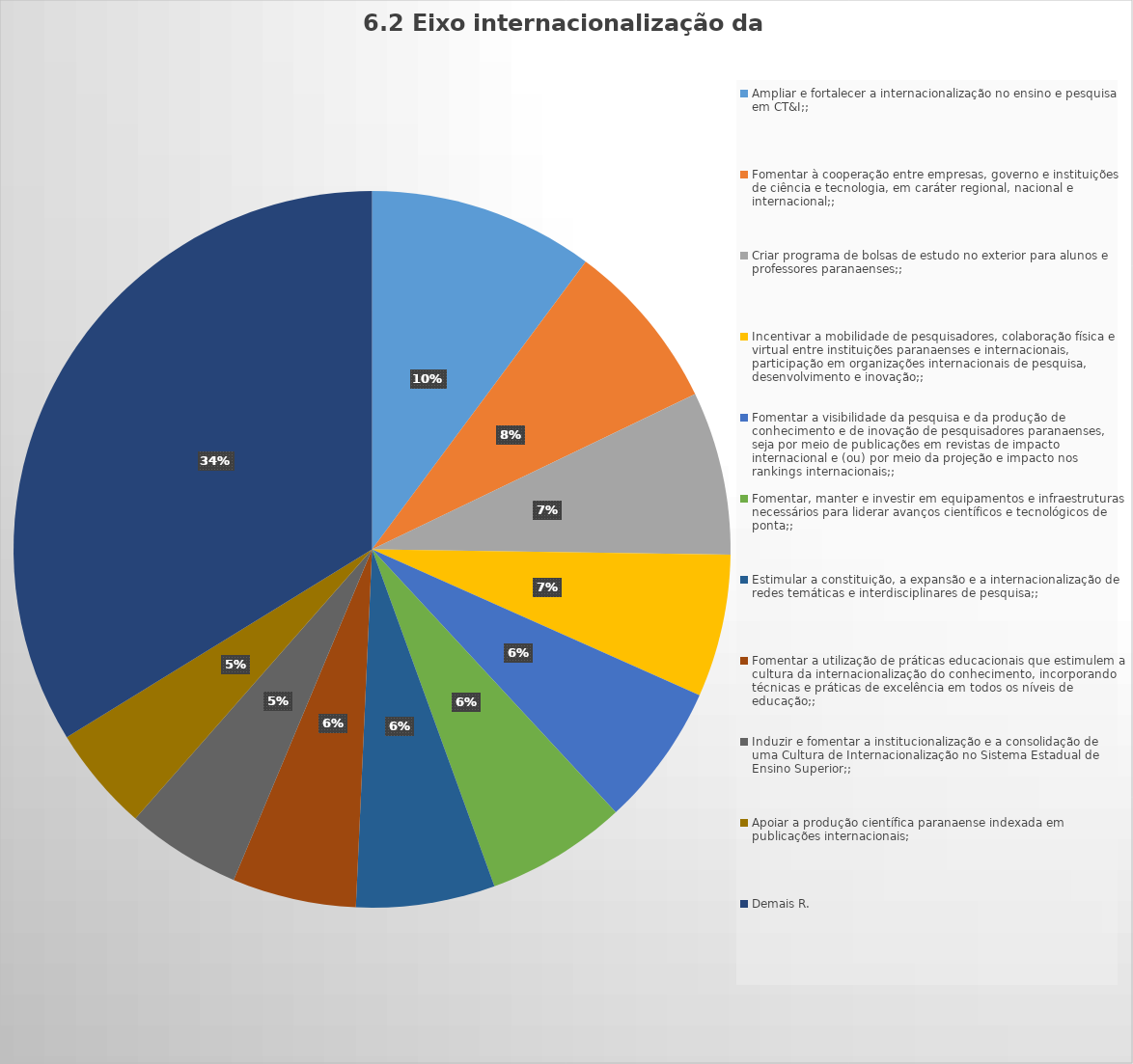
| Category | Series 0 |
|---|---|
| Ampliar e fortalecer a internacionalização no ensino e pesquisa em CT&I;; | 120 |
| Fomentar à cooperação entre empresas, governo e instituições de ciência e tecnologia, em caráter regional, nacional e internacional;; | 91 |
| Criar programa de bolsas de estudo no exterior para alunos e professores paranaenses;; | 87 |
| Incentivar a mobilidade de pesquisadores, colaboração física e virtual entre instituições paranaenses e internacionais, participação em organizações internacionais de pesquisa, desenvolvimento e inovação;; | 76 |
| Fomentar a visibilidade da pesquisa e da produção de conhecimento e de inovação de pesquisadores paranaenses, seja por meio de publicações em revistas de impacto internacional e (ou) por meio da projeção e impacto nos rankings internacionais;; | 76 |
| Fomentar, manter e investir em equipamentos e infraestruturas necessários para liderar avanços científicos e tecnológicos de ponta;; | 75 |
| Estimular a constituição, a expansão e a internacionalização de redes temáticas e interdisciplinares de pesquisa;; | 74 |
| Fomentar a utilização de práticas educacionais que estimulem a cultura da internacionalização do conhecimento, incorporando técnicas e práticas de excelência em todos os níveis de educação;; | 66 |
| Induzir e fomentar a institucionalização e a consolidação de uma Cultura de Internacionalização no Sistema Estadual de Ensino Superior;; | 61 |
| Apoiar a produção científica paranaense indexada em publicações internacionais; | 56 |
| Demais R. | 399 |